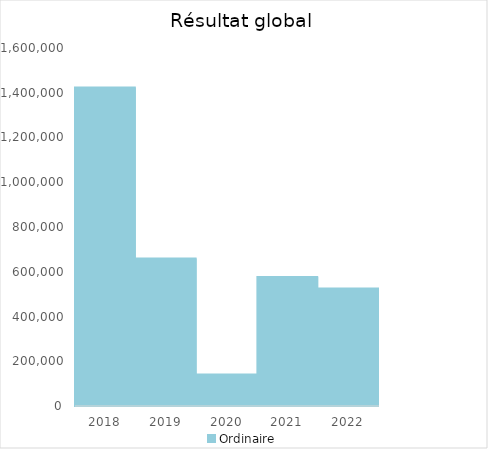
| Category |   | Ordinaire |    |
|---|---|---|---|
| 2018.0 |  | 1423526.2 |  |
| 2019.0 |  | 658722.04 |  |
| 2020.0 |  | 140896.09 |  |
| 2021.0 |  | 576928.96 |  |
| 2022.0 |  | 524660.07 |  |